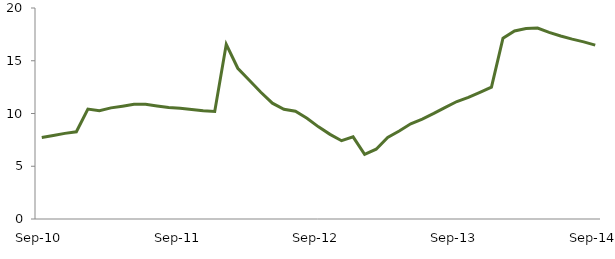
| Category | Series 0 |
|---|---|
| Sep-10 | 7.725 |
|  | 7.91 |
|  | 8.116 |
|  | 8.269 |
|  | 10.421 |
|  | 10.256 |
|  | 10.532 |
|  | 10.695 |
|  | 10.88 |
|  | 10.867 |
|  | 10.717 |
|  | 10.566 |
| Sep-11 | 10.492 |
|  | 10.372 |
|  | 10.261 |
|  | 10.197 |
|  | 16.554 |
|  | 14.287 |
|  | 13.149 |
|  | 12.01 |
|  | 10.979 |
|  | 10.402 |
|  | 10.221 |
|  | 9.554 |
| Sep-12 | 8.736 |
|  | 8.023 |
|  | 7.421 |
|  | 7.783 |
|  | 6.12 |
|  | 6.613 |
|  | 7.721 |
|  | 8.337 |
|  | 9.021 |
|  | 9.471 |
|  | 10.005 |
|  | 10.58 |
| Sep-13 | 11.134 |
|  | 11.529 |
|  | 12.009 |
|  | 12.5 |
|  | 17.13 |
|  | 17.828 |
|  | 18.046 |
|  | 18.095 |
|  | 17.683 |
|  | 17.351 |
|  | 17.046 |
|  | 16.788 |
| Sep-14 | 16.483 |